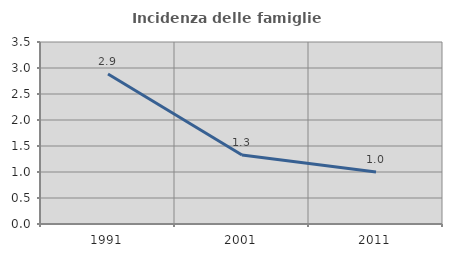
| Category | Incidenza delle famiglie numerose |
|---|---|
| 1991.0 | 2.885 |
| 2001.0 | 1.328 |
| 2011.0 | 1.001 |